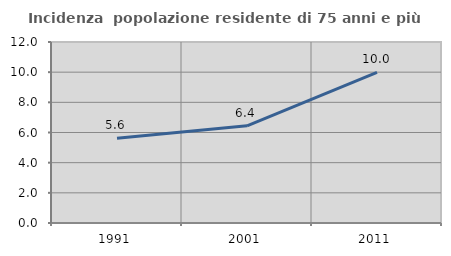
| Category | Incidenza  popolazione residente di 75 anni e più |
|---|---|
| 1991.0 | 5.625 |
| 2001.0 | 6.444 |
| 2011.0 | 9.989 |